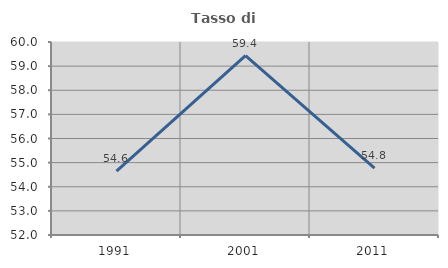
| Category | Tasso di occupazione   |
|---|---|
| 1991.0 | 54.645 |
| 2001.0 | 59.437 |
| 2011.0 | 54.769 |